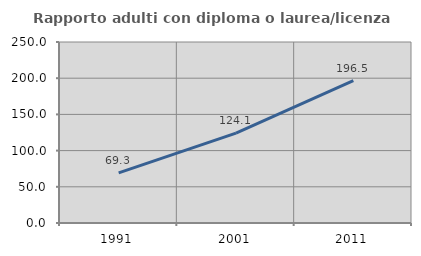
| Category | Rapporto adulti con diploma o laurea/licenza media  |
|---|---|
| 1991.0 | 69.307 |
| 2001.0 | 124.138 |
| 2011.0 | 196.532 |